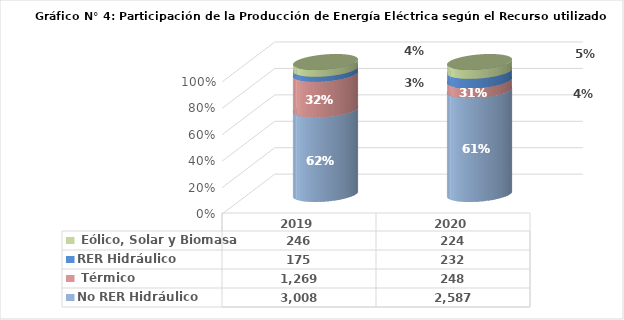
| Category | No RER | RER |
|---|---|---|
| 2019.0 | 1269.319 | 245.532 |
| 2020.0 | 248.219 | 223.813 |